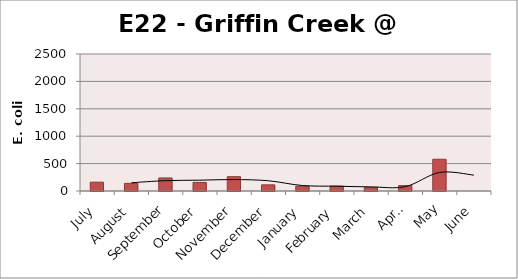
| Category | E. coli MPN |
|---|---|
| July | 160.7 |
| August | 139.6 |
| September | 238.2 |
| October | 156.5 |
| November | 261.3 |
| December | 112.6 |
| January | 86.7 |
| February | 88.4 |
| March | 61.7 |
| April | 98.5 |
| May | 579.4 |
| June | 0 |